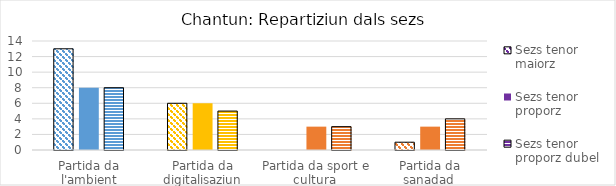
| Category | Sezs tenor maiorz | Sezs tenor proporz | Sezs tenor proporz dubel |
|---|---|---|---|
| Partida da l'ambient | 13 | 8 | 8 |
| Partida da digitalisaziun | 6 | 6 | 5 |
| Partida da sport e cultura  | 0 | 3 | 3 |
| Partida da sanadad  | 1 | 3 | 4 |